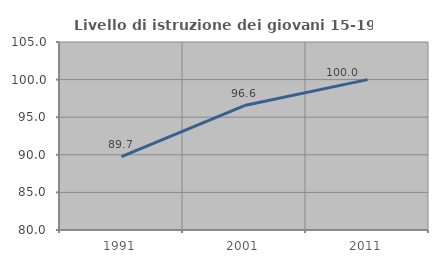
| Category | Livello di istruzione dei giovani 15-19 anni |
|---|---|
| 1991.0 | 89.744 |
| 2001.0 | 96.552 |
| 2011.0 | 100 |